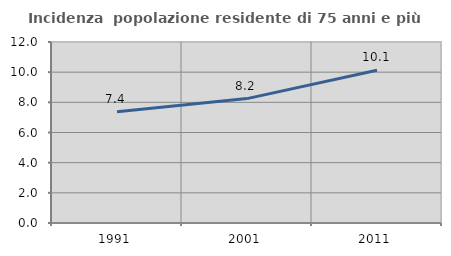
| Category | Incidenza  popolazione residente di 75 anni e più |
|---|---|
| 1991.0 | 7.376 |
| 2001.0 | 8.247 |
| 2011.0 | 10.124 |